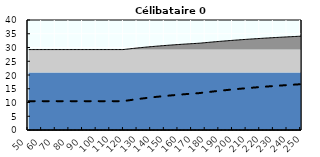
| Category | Coin fiscal moyen (somme des composantes) | Taux moyen d'imposition net en % du salaire brut |
|---|---|---|
| 50.0 | 29.249 | 10.5 |
| 51.0 | 29.249 | 10.5 |
| 52.0 | 29.249 | 10.5 |
| 53.0 | 29.249 | 10.5 |
| 54.0 | 29.249 | 10.5 |
| 55.0 | 29.249 | 10.5 |
| 56.0 | 29.249 | 10.5 |
| 57.0 | 29.249 | 10.5 |
| 58.0 | 29.249 | 10.5 |
| 59.0 | 29.249 | 10.5 |
| 60.0 | 29.249 | 10.5 |
| 61.0 | 29.249 | 10.5 |
| 62.0 | 29.249 | 10.5 |
| 63.0 | 29.249 | 10.5 |
| 64.0 | 29.249 | 10.5 |
| 65.0 | 29.249 | 10.5 |
| 66.0 | 29.249 | 10.5 |
| 67.0 | 29.249 | 10.5 |
| 68.0 | 29.249 | 10.5 |
| 69.0 | 29.249 | 10.5 |
| 70.0 | 29.249 | 10.5 |
| 71.0 | 29.249 | 10.5 |
| 72.0 | 29.249 | 10.5 |
| 73.0 | 29.249 | 10.5 |
| 74.0 | 29.249 | 10.5 |
| 75.0 | 29.249 | 10.5 |
| 76.0 | 29.249 | 10.5 |
| 77.0 | 29.249 | 10.5 |
| 78.0 | 29.249 | 10.5 |
| 79.0 | 29.249 | 10.5 |
| 80.0 | 29.249 | 10.5 |
| 81.0 | 29.249 | 10.5 |
| 82.0 | 29.249 | 10.5 |
| 83.0 | 29.249 | 10.5 |
| 84.0 | 29.249 | 10.5 |
| 85.0 | 29.249 | 10.5 |
| 86.0 | 29.249 | 10.5 |
| 87.0 | 29.249 | 10.5 |
| 88.0 | 29.249 | 10.5 |
| 89.0 | 29.249 | 10.5 |
| 90.0 | 29.249 | 10.5 |
| 91.0 | 29.249 | 10.5 |
| 92.0 | 29.249 | 10.5 |
| 93.0 | 29.249 | 10.5 |
| 94.0 | 29.249 | 10.5 |
| 95.0 | 29.249 | 10.5 |
| 96.0 | 29.249 | 10.5 |
| 97.0 | 29.249 | 10.5 |
| 98.0 | 29.249 | 10.5 |
| 99.0 | 29.249 | 10.5 |
| 100.0 | 29.249 | 10.5 |
| 101.0 | 29.249 | 10.5 |
| 102.0 | 29.249 | 10.5 |
| 103.0 | 29.249 | 10.5 |
| 104.0 | 29.249 | 10.5 |
| 105.0 | 29.249 | 10.5 |
| 106.0 | 29.249 | 10.5 |
| 107.0 | 29.249 | 10.5 |
| 108.0 | 29.249 | 10.5 |
| 109.0 | 29.249 | 10.5 |
| 110.0 | 29.249 | 10.5 |
| 111.0 | 29.249 | 10.5 |
| 112.0 | 29.249 | 10.5 |
| 113.0 | 29.249 | 10.5 |
| 114.0 | 29.249 | 10.5 |
| 115.0 | 29.249 | 10.5 |
| 116.0 | 29.249 | 10.5 |
| 117.0 | 29.249 | 10.5 |
| 118.0 | 29.249 | 10.5 |
| 119.0 | 29.249 | 10.5 |
| 120.0 | 29.282 | 10.541 |
| 121.0 | 29.341 | 10.617 |
| 122.0 | 29.4 | 10.691 |
| 123.0 | 29.458 | 10.764 |
| 124.0 | 29.515 | 10.836 |
| 125.0 | 29.57 | 10.907 |
| 126.0 | 29.625 | 10.976 |
| 127.0 | 29.68 | 11.045 |
| 128.0 | 29.733 | 11.112 |
| 129.0 | 29.785 | 11.179 |
| 130.0 | 29.837 | 11.244 |
| 131.0 | 29.888 | 11.308 |
| 132.0 | 29.938 | 11.372 |
| 133.0 | 29.988 | 11.434 |
| 134.0 | 30.036 | 11.496 |
| 135.0 | 30.084 | 11.556 |
| 136.0 | 30.131 | 11.616 |
| 137.0 | 30.178 | 11.675 |
| 138.0 | 30.224 | 11.733 |
| 139.0 | 30.269 | 11.79 |
| 140.0 | 30.313 | 11.846 |
| 141.0 | 30.357 | 11.902 |
| 142.0 | 30.401 | 11.957 |
| 143.0 | 30.443 | 12.011 |
| 144.0 | 30.485 | 12.064 |
| 145.0 | 30.527 | 12.116 |
| 146.0 | 30.568 | 12.168 |
| 147.0 | 30.608 | 12.219 |
| 148.0 | 30.648 | 12.27 |
| 149.0 | 30.687 | 12.319 |
| 150.0 | 30.726 | 12.369 |
| 151.0 | 30.764 | 12.417 |
| 152.0 | 30.802 | 12.465 |
| 153.0 | 30.839 | 12.512 |
| 154.0 | 30.876 | 12.558 |
| 155.0 | 30.912 | 12.604 |
| 156.0 | 30.948 | 12.65 |
| 157.0 | 30.984 | 12.694 |
| 158.0 | 31.019 | 12.739 |
| 159.0 | 31.053 | 12.782 |
| 160.0 | 31.087 | 12.825 |
| 161.0 | 31.121 | 12.868 |
| 162.0 | 31.154 | 12.91 |
| 163.0 | 31.187 | 12.951 |
| 164.0 | 31.219 | 12.992 |
| 165.0 | 31.251 | 13.033 |
| 166.0 | 31.283 | 13.073 |
| 167.0 | 31.314 | 13.113 |
| 168.0 | 31.345 | 13.152 |
| 169.0 | 31.376 | 13.19 |
| 170.0 | 31.406 | 13.228 |
| 171.0 | 31.436 | 13.266 |
| 172.0 | 31.465 | 13.303 |
| 173.0 | 31.494 | 13.34 |
| 174.0 | 31.523 | 13.377 |
| 175.0 | 31.552 | 13.413 |
| 176.0 | 31.592 | 13.464 |
| 177.0 | 31.641 | 13.525 |
| 178.0 | 31.688 | 13.586 |
| 179.0 | 31.735 | 13.645 |
| 180.0 | 31.782 | 13.704 |
| 181.0 | 31.828 | 13.763 |
| 182.0 | 31.874 | 13.82 |
| 183.0 | 31.919 | 13.878 |
| 184.0 | 31.964 | 13.934 |
| 185.0 | 32.008 | 13.99 |
| 186.0 | 32.051 | 14.045 |
| 187.0 | 32.095 | 14.1 |
| 188.0 | 32.137 | 14.154 |
| 189.0 | 32.18 | 14.207 |
| 190.0 | 32.222 | 14.26 |
| 191.0 | 32.263 | 14.313 |
| 192.0 | 32.304 | 14.365 |
| 193.0 | 32.345 | 14.416 |
| 194.0 | 32.385 | 14.467 |
| 195.0 | 32.424 | 14.517 |
| 196.0 | 32.464 | 14.567 |
| 197.0 | 32.503 | 14.616 |
| 198.0 | 32.541 | 14.665 |
| 199.0 | 32.579 | 14.713 |
| 200.0 | 32.617 | 14.761 |
| 201.0 | 32.655 | 14.808 |
| 202.0 | 32.692 | 14.855 |
| 203.0 | 32.728 | 14.901 |
| 204.0 | 32.764 | 14.947 |
| 205.0 | 32.8 | 14.993 |
| 206.0 | 32.836 | 15.038 |
| 207.0 | 32.871 | 15.082 |
| 208.0 | 32.906 | 15.126 |
| 209.0 | 32.941 | 15.17 |
| 210.0 | 32.975 | 15.213 |
| 211.0 | 33.009 | 15.256 |
| 212.0 | 33.042 | 15.299 |
| 213.0 | 33.076 | 15.341 |
| 214.0 | 33.109 | 15.383 |
| 215.0 | 33.141 | 15.424 |
| 216.0 | 33.174 | 15.465 |
| 217.0 | 33.206 | 15.505 |
| 218.0 | 33.238 | 15.546 |
| 219.0 | 33.269 | 15.585 |
| 220.0 | 33.3 | 15.625 |
| 221.0 | 33.331 | 15.664 |
| 222.0 | 33.362 | 15.703 |
| 223.0 | 33.392 | 15.741 |
| 224.0 | 33.422 | 15.779 |
| 225.0 | 33.452 | 15.817 |
| 226.0 | 33.482 | 15.854 |
| 227.0 | 33.511 | 15.891 |
| 228.0 | 33.54 | 15.928 |
| 229.0 | 33.569 | 15.965 |
| 230.0 | 33.597 | 16.001 |
| 231.0 | 33.626 | 16.036 |
| 232.0 | 33.654 | 16.072 |
| 233.0 | 33.681 | 16.107 |
| 234.0 | 33.709 | 16.142 |
| 235.0 | 33.736 | 16.177 |
| 236.0 | 33.763 | 16.211 |
| 237.0 | 33.79 | 16.245 |
| 238.0 | 33.817 | 16.278 |
| 239.0 | 33.843 | 16.312 |
| 240.0 | 33.87 | 16.345 |
| 241.0 | 33.896 | 16.378 |
| 242.0 | 33.921 | 16.411 |
| 243.0 | 33.947 | 16.443 |
| 244.0 | 33.972 | 16.475 |
| 245.0 | 33.997 | 16.507 |
| 246.0 | 34.022 | 16.538 |
| 247.0 | 34.047 | 16.57 |
| 248.0 | 34.072 | 16.601 |
| 249.0 | 34.096 | 16.631 |
| 250.0 | 34.12 | 16.662 |